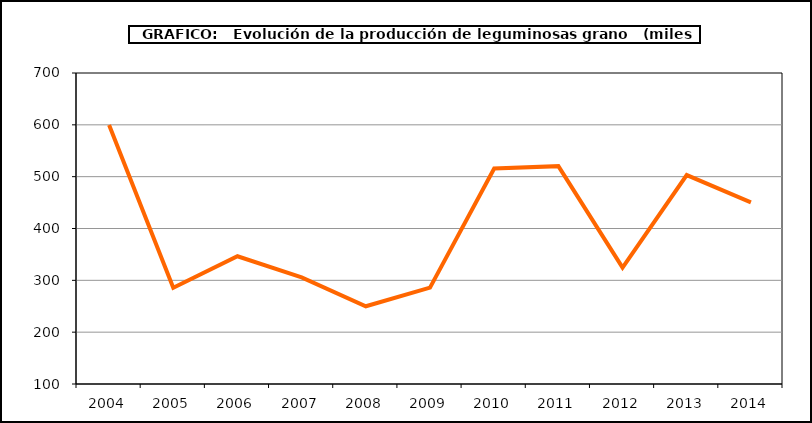
| Category | Producción |
|---|---|
| 2004.0 | 599.829 |
| 2005.0 | 285.509 |
| 2006.0 | 346.489 |
| 2007.0 | 305.792 |
| 2008.0 | 249.984 |
| 2009.0 | 285.879 |
| 2010.0 | 515.802 |
| 2011.0 | 520.288 |
| 2012.0 | 324.471 |
| 2013.0 | 503.069 |
| 2014.0 | 450.507 |